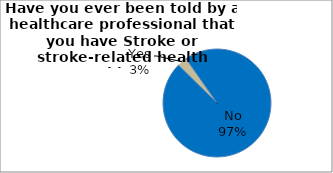
| Category | Series 0 |
|---|---|
| No | 97.097 |
| Yes | 2.903 |